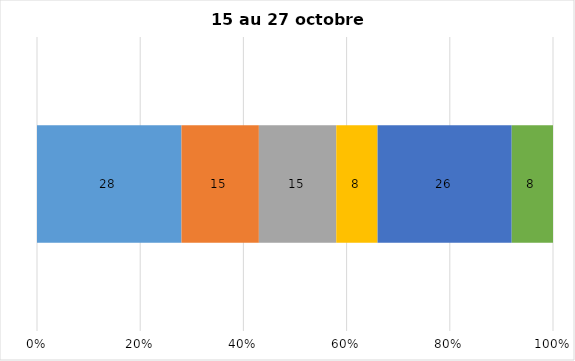
| Category | Plusieurs fois par jour | Une fois par jour | Quelques fois par semaine   | Une fois par semaine ou moins   |  Jamais   |  Je n’utilise pas les médias sociaux |
|---|---|---|---|---|---|---|
| 0 | 28 | 15 | 15 | 8 | 26 | 8 |